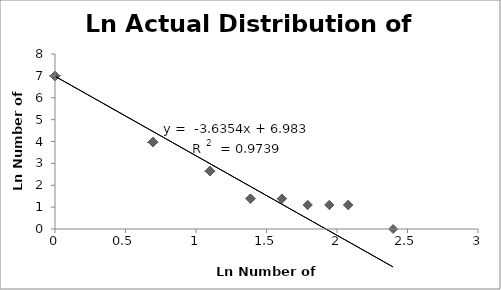
| Category | LnActual Number of Athletes |
|---|---|
| 2.3978952727983707 | 0 |
| 2.0794415416798357 | 1.099 |
| 2.0794415416798357 | 1.099 |
| 2.0794415416798357 | 1.099 |
| 1.9459101490553132 | 1.099 |
| 1.9459101490553132 | 1.099 |
| 1.9459101490553132 | 1.099 |
| 1.791759469228055 | 1.099 |
| 1.791759469228055 | 1.099 |
| 1.791759469228055 | 1.099 |
| 1.6094379124341003 | 1.386 |
| 1.6094379124341003 | 1.386 |
| 1.6094379124341003 | 1.386 |
| 1.6094379124341003 | 1.386 |
| 1.3862943611198906 | 1.386 |
| 1.3862943611198906 | 1.386 |
| 1.3862943611198906 | 1.386 |
| 1.3862943611198906 | 1.386 |
| 1.0986122886681098 | 2.639 |
| 1.0986122886681098 | 2.639 |
| 1.0986122886681098 | 2.639 |
| 1.0986122886681098 | 2.639 |
| 1.0986122886681098 | 2.639 |
| 1.0986122886681098 | 2.639 |
| 1.0986122886681098 | 2.639 |
| 1.0986122886681098 | 2.639 |
| 1.0986122886681098 | 2.639 |
| 1.0986122886681098 | 2.639 |
| 1.0986122886681098 | 2.639 |
| 1.0986122886681098 | 2.639 |
| 1.0986122886681098 | 2.639 |
| 1.0986122886681098 | 2.639 |
| 0.6931471805599453 | 3.97 |
| 0.6931471805599453 | 3.97 |
| 0.6931471805599453 | 3.97 |
| 0.6931471805599453 | 3.97 |
| 0.6931471805599453 | 3.97 |
| 0.6931471805599453 | 3.97 |
| 0.6931471805599453 | 3.97 |
| 0.6931471805599453 | 3.97 |
| 0.6931471805599453 | 3.97 |
| 0.6931471805599453 | 3.97 |
| 0.6931471805599453 | 3.97 |
| 0.6931471805599453 | 3.97 |
| 0.6931471805599453 | 3.97 |
| 0.6931471805599453 | 3.97 |
| 0.6931471805599453 | 3.97 |
| 0.6931471805599453 | 3.97 |
| 0.6931471805599453 | 3.97 |
| 0.6931471805599453 | 3.97 |
| 0.6931471805599453 | 3.97 |
| 0.6931471805599453 | 3.97 |
| 0.6931471805599453 | 3.97 |
| 0.6931471805599453 | 3.97 |
| 0.6931471805599453 | 3.97 |
| 0.6931471805599453 | 3.97 |
| 0.6931471805599453 | 3.97 |
| 0.6931471805599453 | 3.97 |
| 0.6931471805599453 | 3.97 |
| 0.6931471805599453 | 3.97 |
| 0.6931471805599453 | 3.97 |
| 0.6931471805599453 | 3.97 |
| 0.6931471805599453 | 3.97 |
| 0.6931471805599453 | 3.97 |
| 0.6931471805599453 | 3.97 |
| 0.6931471805599453 | 3.97 |
| 0.6931471805599453 | 3.97 |
| 0.6931471805599453 | 3.97 |
| 0.6931471805599453 | 3.97 |
| 0.6931471805599453 | 3.97 |
| 0.6931471805599453 | 3.97 |
| 0.6931471805599453 | 3.97 |
| 0.6931471805599453 | 3.97 |
| 0.6931471805599453 | 3.97 |
| 0.6931471805599453 | 3.97 |
| 0.6931471805599453 | 3.97 |
| 0.6931471805599453 | 3.97 |
| 0.6931471805599453 | 3.97 |
| 0.6931471805599453 | 3.97 |
| 0.6931471805599453 | 3.97 |
| 0.6931471805599453 | 3.97 |
| 0.6931471805599453 | 3.97 |
| 0.6931471805599453 | 3.97 |
| 0.6931471805599453 | 3.97 |
| 0.6931471805599453 | 3.97 |
| 0.0 | 7.001 |
| 0.0 | 7.001 |
| 0.0 | 7.001 |
| 0.0 | 7.001 |
| 0.0 | 7.001 |
| 0.0 | 7.001 |
| 0.0 | 7.001 |
| 0.0 | 7.001 |
| 0.0 | 7.001 |
| 0.0 | 7.001 |
| 0.0 | 7.001 |
| 0.0 | 7.001 |
| 0.0 | 7.001 |
| 0.0 | 7.001 |
| 0.0 | 7.001 |
| 0.0 | 7.001 |
| 0.0 | 7.001 |
| 0.0 | 7.001 |
| 0.0 | 7.001 |
| 0.0 | 7.001 |
| 0.0 | 7.001 |
| 0.0 | 7.001 |
| 0.0 | 7.001 |
| 0.0 | 7.001 |
| 0.0 | 7.001 |
| 0.0 | 7.001 |
| 0.0 | 7.001 |
| 0.0 | 7.001 |
| 0.0 | 7.001 |
| 0.0 | 7.001 |
| 0.0 | 7.001 |
| 0.0 | 7.001 |
| 0.0 | 7.001 |
| 0.0 | 7.001 |
| 0.0 | 7.001 |
| 0.0 | 7.001 |
| 0.0 | 7.001 |
| 0.0 | 7.001 |
| 0.0 | 7.001 |
| 0.0 | 7.001 |
| 0.0 | 7.001 |
| 0.0 | 7.001 |
| 0.0 | 7.001 |
| 0.0 | 7.001 |
| 0.0 | 7.001 |
| 0.0 | 7.001 |
| 0.0 | 7.001 |
| 0.0 | 7.001 |
| 0.0 | 7.001 |
| 0.0 | 7.001 |
| 0.0 | 7.001 |
| 0.0 | 7.001 |
| 0.0 | 7.001 |
| 0.0 | 7.001 |
| 0.0 | 7.001 |
| 0.0 | 7.001 |
| 0.0 | 7.001 |
| 0.0 | 7.001 |
| 0.0 | 7.001 |
| 0.0 | 7.001 |
| 0.0 | 7.001 |
| 0.0 | 7.001 |
| 0.0 | 7.001 |
| 0.0 | 7.001 |
| 0.0 | 7.001 |
| 0.0 | 7.001 |
| 0.0 | 7.001 |
| 0.0 | 7.001 |
| 0.0 | 7.001 |
| 0.0 | 7.001 |
| 0.0 | 7.001 |
| 0.0 | 7.001 |
| 0.0 | 7.001 |
| 0.0 | 7.001 |
| 0.0 | 7.001 |
| 0.0 | 7.001 |
| 0.0 | 7.001 |
| 0.0 | 7.001 |
| 0.0 | 7.001 |
| 0.0 | 7.001 |
| 0.0 | 7.001 |
| 0.0 | 7.001 |
| 0.0 | 7.001 |
| 0.0 | 7.001 |
| 0.0 | 7.001 |
| 0.0 | 7.001 |
| 0.0 | 7.001 |
| 0.0 | 7.001 |
| 0.0 | 7.001 |
| 0.0 | 7.001 |
| 0.0 | 7.001 |
| 0.0 | 7.001 |
| 0.0 | 7.001 |
| 0.0 | 7.001 |
| 0.0 | 7.001 |
| 0.0 | 7.001 |
| 0.0 | 7.001 |
| 0.0 | 7.001 |
| 0.0 | 7.001 |
| 0.0 | 7.001 |
| 0.0 | 7.001 |
| 0.0 | 7.001 |
| 0.0 | 7.001 |
| 0.0 | 7.001 |
| 0.0 | 7.001 |
| 0.0 | 7.001 |
| 0.0 | 7.001 |
| 0.0 | 7.001 |
| 0.0 | 7.001 |
| 0.0 | 7.001 |
| 0.0 | 7.001 |
| 0.0 | 7.001 |
| 0.0 | 7.001 |
| 0.0 | 7.001 |
| 0.0 | 7.001 |
| 0.0 | 7.001 |
| 0.0 | 7.001 |
| 0.0 | 7.001 |
| 0.0 | 7.001 |
| 0.0 | 7.001 |
| 0.0 | 7.001 |
| 0.0 | 7.001 |
| 0.0 | 7.001 |
| 0.0 | 7.001 |
| 0.0 | 7.001 |
| 0.0 | 7.001 |
| 0.0 | 7.001 |
| 0.0 | 7.001 |
| 0.0 | 7.001 |
| 0.0 | 7.001 |
| 0.0 | 7.001 |
| 0.0 | 7.001 |
| 0.0 | 7.001 |
| 0.0 | 7.001 |
| 0.0 | 7.001 |
| 0.0 | 7.001 |
| 0.0 | 7.001 |
| 0.0 | 7.001 |
| 0.0 | 7.001 |
| 0.0 | 7.001 |
| 0.0 | 7.001 |
| 0.0 | 7.001 |
| 0.0 | 7.001 |
| 0.0 | 7.001 |
| 0.0 | 7.001 |
| 0.0 | 7.001 |
| 0.0 | 7.001 |
| 0.0 | 7.001 |
| 0.0 | 7.001 |
| 0.0 | 7.001 |
| 0.0 | 7.001 |
| 0.0 | 7.001 |
| 0.0 | 7.001 |
| 0.0 | 7.001 |
| 0.0 | 7.001 |
| 0.0 | 7.001 |
| 0.0 | 7.001 |
| 0.0 | 7.001 |
| 0.0 | 7.001 |
| 0.0 | 7.001 |
| 0.0 | 7.001 |
| 0.0 | 7.001 |
| 0.0 | 7.001 |
| 0.0 | 7.001 |
| 0.0 | 7.001 |
| 0.0 | 7.001 |
| 0.0 | 7.001 |
| 0.0 | 7.001 |
| 0.0 | 7.001 |
| 0.0 | 7.001 |
| 0.0 | 7.001 |
| 0.0 | 7.001 |
| 0.0 | 7.001 |
| 0.0 | 7.001 |
| 0.0 | 7.001 |
| 0.0 | 7.001 |
| 0.0 | 7.001 |
| 0.0 | 7.001 |
| 0.0 | 7.001 |
| 0.0 | 7.001 |
| 0.0 | 7.001 |
| 0.0 | 7.001 |
| 0.0 | 7.001 |
| 0.0 | 7.001 |
| 0.0 | 7.001 |
| 0.0 | 7.001 |
| 0.0 | 7.001 |
| 0.0 | 7.001 |
| 0.0 | 7.001 |
| 0.0 | 7.001 |
| 0.0 | 7.001 |
| 0.0 | 7.001 |
| 0.0 | 7.001 |
| 0.0 | 7.001 |
| 0.0 | 7.001 |
| 0.0 | 7.001 |
| 0.0 | 7.001 |
| 0.0 | 7.001 |
| 0.0 | 7.001 |
| 0.0 | 7.001 |
| 0.0 | 7.001 |
| 0.0 | 7.001 |
| 0.0 | 7.001 |
| 0.0 | 7.001 |
| 0.0 | 7.001 |
| 0.0 | 7.001 |
| 0.0 | 7.001 |
| 0.0 | 7.001 |
| 0.0 | 7.001 |
| 0.0 | 7.001 |
| 0.0 | 7.001 |
| 0.0 | 7.001 |
| 0.0 | 7.001 |
| 0.0 | 7.001 |
| 0.0 | 7.001 |
| 0.0 | 7.001 |
| 0.0 | 7.001 |
| 0.0 | 7.001 |
| 0.0 | 7.001 |
| 0.0 | 7.001 |
| 0.0 | 7.001 |
| 0.0 | 7.001 |
| 0.0 | 7.001 |
| 0.0 | 7.001 |
| 0.0 | 7.001 |
| 0.0 | 7.001 |
| 0.0 | 7.001 |
| 0.0 | 7.001 |
| 0.0 | 7.001 |
| 0.0 | 7.001 |
| 0.0 | 7.001 |
| 0.0 | 7.001 |
| 0.0 | 7.001 |
| 0.0 | 7.001 |
| 0.0 | 7.001 |
| 0.0 | 7.001 |
| 0.0 | 7.001 |
| 0.0 | 7.001 |
| 0.0 | 7.001 |
| 0.0 | 7.001 |
| 0.0 | 7.001 |
| 0.0 | 7.001 |
| 0.0 | 7.001 |
| 0.0 | 7.001 |
| 0.0 | 7.001 |
| 0.0 | 7.001 |
| 0.0 | 7.001 |
| 0.0 | 7.001 |
| 0.0 | 7.001 |
| 0.0 | 7.001 |
| 0.0 | 7.001 |
| 0.0 | 7.001 |
| 0.0 | 7.001 |
| 0.0 | 7.001 |
| 0.0 | 7.001 |
| 0.0 | 7.001 |
| 0.0 | 7.001 |
| 0.0 | 7.001 |
| 0.0 | 7.001 |
| 0.0 | 7.001 |
| 0.0 | 7.001 |
| 0.0 | 7.001 |
| 0.0 | 7.001 |
| 0.0 | 7.001 |
| 0.0 | 7.001 |
| 0.0 | 7.001 |
| 0.0 | 7.001 |
| 0.0 | 7.001 |
| 0.0 | 7.001 |
| 0.0 | 7.001 |
| 0.0 | 7.001 |
| 0.0 | 7.001 |
| 0.0 | 7.001 |
| 0.0 | 7.001 |
| 0.0 | 7.001 |
| 0.0 | 7.001 |
| 0.0 | 7.001 |
| 0.0 | 7.001 |
| 0.0 | 7.001 |
| 0.0 | 7.001 |
| 0.0 | 7.001 |
| 0.0 | 7.001 |
| 0.0 | 7.001 |
| 0.0 | 7.001 |
| 0.0 | 7.001 |
| 0.0 | 7.001 |
| 0.0 | 7.001 |
| 0.0 | 7.001 |
| 0.0 | 7.001 |
| 0.0 | 7.001 |
| 0.0 | 7.001 |
| 0.0 | 7.001 |
| 0.0 | 7.001 |
| 0.0 | 7.001 |
| 0.0 | 7.001 |
| 0.0 | 7.001 |
| 0.0 | 7.001 |
| 0.0 | 7.001 |
| 0.0 | 7.001 |
| 0.0 | 7.001 |
| 0.0 | 7.001 |
| 0.0 | 7.001 |
| 0.0 | 7.001 |
| 0.0 | 7.001 |
| 0.0 | 7.001 |
| 0.0 | 7.001 |
| 0.0 | 7.001 |
| 0.0 | 7.001 |
| 0.0 | 7.001 |
| 0.0 | 7.001 |
| 0.0 | 7.001 |
| 0.0 | 7.001 |
| 0.0 | 7.001 |
| 0.0 | 7.001 |
| 0.0 | 7.001 |
| 0.0 | 7.001 |
| 0.0 | 7.001 |
| 0.0 | 7.001 |
| 0.0 | 7.001 |
| 0.0 | 7.001 |
| 0.0 | 7.001 |
| 0.0 | 7.001 |
| 0.0 | 7.001 |
| 0.0 | 7.001 |
| 0.0 | 7.001 |
| 0.0 | 7.001 |
| 0.0 | 7.001 |
| 0.0 | 7.001 |
| 0.0 | 7.001 |
| 0.0 | 7.001 |
| 0.0 | 7.001 |
| 0.0 | 7.001 |
| 0.0 | 7.001 |
| 0.0 | 7.001 |
| 0.0 | 7.001 |
| 0.0 | 7.001 |
| 0.0 | 7.001 |
| 0.0 | 7.001 |
| 0.0 | 7.001 |
| 0.0 | 7.001 |
| 0.0 | 7.001 |
| 0.0 | 7.001 |
| 0.0 | 7.001 |
| 0.0 | 7.001 |
| 0.0 | 7.001 |
| 0.0 | 7.001 |
| 0.0 | 7.001 |
| 0.0 | 7.001 |
| 0.0 | 7.001 |
| 0.0 | 7.001 |
| 0.0 | 7.001 |
| 0.0 | 7.001 |
| 0.0 | 7.001 |
| 0.0 | 7.001 |
| 0.0 | 7.001 |
| 0.0 | 7.001 |
| 0.0 | 7.001 |
| 0.0 | 7.001 |
| 0.0 | 7.001 |
| 0.0 | 7.001 |
| 0.0 | 7.001 |
| 0.0 | 7.001 |
| 0.0 | 7.001 |
| 0.0 | 7.001 |
| 0.0 | 7.001 |
| 0.0 | 7.001 |
| 0.0 | 7.001 |
| 0.0 | 7.001 |
| 0.0 | 7.001 |
| 0.0 | 7.001 |
| 0.0 | 7.001 |
| 0.0 | 7.001 |
| 0.0 | 7.001 |
| 0.0 | 7.001 |
| 0.0 | 7.001 |
| 0.0 | 7.001 |
| 0.0 | 7.001 |
| 0.0 | 7.001 |
| 0.0 | 7.001 |
| 0.0 | 7.001 |
| 0.0 | 7.001 |
| 0.0 | 7.001 |
| 0.0 | 7.001 |
| 0.0 | 7.001 |
| 0.0 | 7.001 |
| 0.0 | 7.001 |
| 0.0 | 7.001 |
| 0.0 | 7.001 |
| 0.0 | 7.001 |
| 0.0 | 7.001 |
| 0.0 | 7.001 |
| 0.0 | 7.001 |
| 0.0 | 7.001 |
| 0.0 | 7.001 |
| 0.0 | 7.001 |
| 0.0 | 7.001 |
| 0.0 | 7.001 |
| 0.0 | 7.001 |
| 0.0 | 7.001 |
| 0.0 | 7.001 |
| 0.0 | 7.001 |
| 0.0 | 7.001 |
| 0.0 | 7.001 |
| 0.0 | 7.001 |
| 0.0 | 7.001 |
| 0.0 | 7.001 |
| 0.0 | 7.001 |
| 0.0 | 7.001 |
| 0.0 | 7.001 |
| 0.0 | 7.001 |
| 0.0 | 7.001 |
| 0.0 | 7.001 |
| 0.0 | 7.001 |
| 0.0 | 7.001 |
| 0.0 | 7.001 |
| 0.0 | 7.001 |
| 0.0 | 7.001 |
| 0.0 | 7.001 |
| 0.0 | 7.001 |
| 0.0 | 7.001 |
| 0.0 | 7.001 |
| 0.0 | 7.001 |
| 0.0 | 7.001 |
| 0.0 | 7.001 |
| 0.0 | 7.001 |
| 0.0 | 7.001 |
| 0.0 | 7.001 |
| 0.0 | 7.001 |
| 0.0 | 7.001 |
| 0.0 | 7.001 |
| 0.0 | 7.001 |
| 0.0 | 7.001 |
| 0.0 | 7.001 |
| 0.0 | 7.001 |
| 0.0 | 7.001 |
| 0.0 | 7.001 |
| 0.0 | 7.001 |
| 0.0 | 7.001 |
| 0.0 | 7.001 |
| 0.0 | 7.001 |
| 0.0 | 7.001 |
| 0.0 | 7.001 |
| 0.0 | 7.001 |
| 0.0 | 7.001 |
| 0.0 | 7.001 |
| 0.0 | 7.001 |
| 0.0 | 7.001 |
| 0.0 | 7.001 |
| 0.0 | 7.001 |
| 0.0 | 7.001 |
| 0.0 | 7.001 |
| 0.0 | 7.001 |
| 0.0 | 7.001 |
| 0.0 | 7.001 |
| 0.0 | 7.001 |
| 0.0 | 7.001 |
| 0.0 | 7.001 |
| 0.0 | 7.001 |
| 0.0 | 7.001 |
| 0.0 | 7.001 |
| 0.0 | 7.001 |
| 0.0 | 7.001 |
| 0.0 | 7.001 |
| 0.0 | 7.001 |
| 0.0 | 7.001 |
| 0.0 | 7.001 |
| 0.0 | 7.001 |
| 0.0 | 7.001 |
| 0.0 | 7.001 |
| 0.0 | 7.001 |
| 0.0 | 7.001 |
| 0.0 | 7.001 |
| 0.0 | 7.001 |
| 0.0 | 7.001 |
| 0.0 | 7.001 |
| 0.0 | 7.001 |
| 0.0 | 7.001 |
| 0.0 | 7.001 |
| 0.0 | 7.001 |
| 0.0 | 7.001 |
| 0.0 | 7.001 |
| 0.0 | 7.001 |
| 0.0 | 7.001 |
| 0.0 | 7.001 |
| 0.0 | 7.001 |
| 0.0 | 7.001 |
| 0.0 | 7.001 |
| 0.0 | 7.001 |
| 0.0 | 7.001 |
| 0.0 | 7.001 |
| 0.0 | 7.001 |
| 0.0 | 7.001 |
| 0.0 | 7.001 |
| 0.0 | 7.001 |
| 0.0 | 7.001 |
| 0.0 | 7.001 |
| 0.0 | 7.001 |
| 0.0 | 7.001 |
| 0.0 | 7.001 |
| 0.0 | 7.001 |
| 0.0 | 7.001 |
| 0.0 | 7.001 |
| 0.0 | 7.001 |
| 0.0 | 7.001 |
| 0.0 | 7.001 |
| 0.0 | 7.001 |
| 0.0 | 7.001 |
| 0.0 | 7.001 |
| 0.0 | 7.001 |
| 0.0 | 7.001 |
| 0.0 | 7.001 |
| 0.0 | 7.001 |
| 0.0 | 7.001 |
| 0.0 | 7.001 |
| 0.0 | 7.001 |
| 0.0 | 7.001 |
| 0.0 | 7.001 |
| 0.0 | 7.001 |
| 0.0 | 7.001 |
| 0.0 | 7.001 |
| 0.0 | 7.001 |
| 0.0 | 7.001 |
| 0.0 | 7.001 |
| 0.0 | 7.001 |
| 0.0 | 7.001 |
| 0.0 | 7.001 |
| 0.0 | 7.001 |
| 0.0 | 7.001 |
| 0.0 | 7.001 |
| 0.0 | 7.001 |
| 0.0 | 7.001 |
| 0.0 | 7.001 |
| 0.0 | 7.001 |
| 0.0 | 7.001 |
| 0.0 | 7.001 |
| 0.0 | 7.001 |
| 0.0 | 7.001 |
| 0.0 | 7.001 |
| 0.0 | 7.001 |
| 0.0 | 7.001 |
| 0.0 | 7.001 |
| 0.0 | 7.001 |
| 0.0 | 7.001 |
| 0.0 | 7.001 |
| 0.0 | 7.001 |
| 0.0 | 7.001 |
| 0.0 | 7.001 |
| 0.0 | 7.001 |
| 0.0 | 7.001 |
| 0.0 | 7.001 |
| 0.0 | 7.001 |
| 0.0 | 7.001 |
| 0.0 | 7.001 |
| 0.0 | 7.001 |
| 0.0 | 7.001 |
| 0.0 | 7.001 |
| 0.0 | 7.001 |
| 0.0 | 7.001 |
| 0.0 | 7.001 |
| 0.0 | 7.001 |
| 0.0 | 7.001 |
| 0.0 | 7.001 |
| 0.0 | 7.001 |
| 0.0 | 7.001 |
| 0.0 | 7.001 |
| 0.0 | 7.001 |
| 0.0 | 7.001 |
| 0.0 | 7.001 |
| 0.0 | 7.001 |
| 0.0 | 7.001 |
| 0.0 | 7.001 |
| 0.0 | 7.001 |
| 0.0 | 7.001 |
| 0.0 | 7.001 |
| 0.0 | 7.001 |
| 0.0 | 7.001 |
| 0.0 | 7.001 |
| 0.0 | 7.001 |
| 0.0 | 7.001 |
| 0.0 | 7.001 |
| 0.0 | 7.001 |
| 0.0 | 7.001 |
| 0.0 | 7.001 |
| 0.0 | 7.001 |
| 0.0 | 7.001 |
| 0.0 | 7.001 |
| 0.0 | 7.001 |
| 0.0 | 7.001 |
| 0.0 | 7.001 |
| 0.0 | 7.001 |
| 0.0 | 7.001 |
| 0.0 | 7.001 |
| 0.0 | 7.001 |
| 0.0 | 7.001 |
| 0.0 | 7.001 |
| 0.0 | 7.001 |
| 0.0 | 7.001 |
| 0.0 | 7.001 |
| 0.0 | 7.001 |
| 0.0 | 7.001 |
| 0.0 | 7.001 |
| 0.0 | 7.001 |
| 0.0 | 7.001 |
| 0.0 | 7.001 |
| 0.0 | 7.001 |
| 0.0 | 7.001 |
| 0.0 | 7.001 |
| 0.0 | 7.001 |
| 0.0 | 7.001 |
| 0.0 | 7.001 |
| 0.0 | 7.001 |
| 0.0 | 7.001 |
| 0.0 | 7.001 |
| 0.0 | 7.001 |
| 0.0 | 7.001 |
| 0.0 | 7.001 |
| 0.0 | 7.001 |
| 0.0 | 7.001 |
| 0.0 | 7.001 |
| 0.0 | 7.001 |
| 0.0 | 7.001 |
| 0.0 | 7.001 |
| 0.0 | 7.001 |
| 0.0 | 7.001 |
| 0.0 | 7.001 |
| 0.0 | 7.001 |
| 0.0 | 7.001 |
| 0.0 | 7.001 |
| 0.0 | 7.001 |
| 0.0 | 7.001 |
| 0.0 | 7.001 |
| 0.0 | 7.001 |
| 0.0 | 7.001 |
| 0.0 | 7.001 |
| 0.0 | 7.001 |
| 0.0 | 7.001 |
| 0.0 | 7.001 |
| 0.0 | 7.001 |
| 0.0 | 7.001 |
| 0.0 | 7.001 |
| 0.0 | 7.001 |
| 0.0 | 7.001 |
| 0.0 | 7.001 |
| 0.0 | 7.001 |
| 0.0 | 7.001 |
| 0.0 | 7.001 |
| 0.0 | 7.001 |
| 0.0 | 7.001 |
| 0.0 | 7.001 |
| 0.0 | 7.001 |
| 0.0 | 7.001 |
| 0.0 | 7.001 |
| 0.0 | 7.001 |
| 0.0 | 7.001 |
| 0.0 | 7.001 |
| 0.0 | 7.001 |
| 0.0 | 7.001 |
| 0.0 | 7.001 |
| 0.0 | 7.001 |
| 0.0 | 7.001 |
| 0.0 | 7.001 |
| 0.0 | 7.001 |
| 0.0 | 7.001 |
| 0.0 | 7.001 |
| 0.0 | 7.001 |
| 0.0 | 7.001 |
| 0.0 | 7.001 |
| 0.0 | 7.001 |
| 0.0 | 7.001 |
| 0.0 | 7.001 |
| 0.0 | 7.001 |
| 0.0 | 7.001 |
| 0.0 | 7.001 |
| 0.0 | 7.001 |
| 0.0 | 7.001 |
| 0.0 | 7.001 |
| 0.0 | 7.001 |
| 0.0 | 7.001 |
| 0.0 | 7.001 |
| 0.0 | 7.001 |
| 0.0 | 7.001 |
| 0.0 | 7.001 |
| 0.0 | 7.001 |
| 0.0 | 7.001 |
| 0.0 | 7.001 |
| 0.0 | 7.001 |
| 0.0 | 7.001 |
| 0.0 | 7.001 |
| 0.0 | 7.001 |
| 0.0 | 7.001 |
| 0.0 | 7.001 |
| 0.0 | 7.001 |
| 0.0 | 7.001 |
| 0.0 | 7.001 |
| 0.0 | 7.001 |
| 0.0 | 7.001 |
| 0.0 | 7.001 |
| 0.0 | 7.001 |
| 0.0 | 7.001 |
| 0.0 | 7.001 |
| 0.0 | 7.001 |
| 0.0 | 7.001 |
| 0.0 | 7.001 |
| 0.0 | 7.001 |
| 0.0 | 7.001 |
| 0.0 | 7.001 |
| 0.0 | 7.001 |
| 0.0 | 7.001 |
| 0.0 | 7.001 |
| 0.0 | 7.001 |
| 0.0 | 7.001 |
| 0.0 | 7.001 |
| 0.0 | 7.001 |
| 0.0 | 7.001 |
| 0.0 | 7.001 |
| 0.0 | 7.001 |
| 0.0 | 7.001 |
| 0.0 | 7.001 |
| 0.0 | 7.001 |
| 0.0 | 7.001 |
| 0.0 | 7.001 |
| 0.0 | 7.001 |
| 0.0 | 7.001 |
| 0.0 | 7.001 |
| 0.0 | 7.001 |
| 0.0 | 7.001 |
| 0.0 | 7.001 |
| 0.0 | 7.001 |
| 0.0 | 7.001 |
| 0.0 | 7.001 |
| 0.0 | 7.001 |
| 0.0 | 7.001 |
| 0.0 | 7.001 |
| 0.0 | 7.001 |
| 0.0 | 7.001 |
| 0.0 | 7.001 |
| 0.0 | 7.001 |
| 0.0 | 7.001 |
| 0.0 | 7.001 |
| 0.0 | 7.001 |
| 0.0 | 7.001 |
| 0.0 | 7.001 |
| 0.0 | 7.001 |
| 0.0 | 7.001 |
| 0.0 | 7.001 |
| 0.0 | 7.001 |
| 0.0 | 7.001 |
| 0.0 | 7.001 |
| 0.0 | 7.001 |
| 0.0 | 7.001 |
| 0.0 | 7.001 |
| 0.0 | 7.001 |
| 0.0 | 7.001 |
| 0.0 | 7.001 |
| 0.0 | 7.001 |
| 0.0 | 7.001 |
| 0.0 | 7.001 |
| 0.0 | 7.001 |
| 0.0 | 7.001 |
| 0.0 | 7.001 |
| 0.0 | 7.001 |
| 0.0 | 7.001 |
| 0.0 | 7.001 |
| 0.0 | 7.001 |
| 0.0 | 7.001 |
| 0.0 | 7.001 |
| 0.0 | 7.001 |
| 0.0 | 7.001 |
| 0.0 | 7.001 |
| 0.0 | 7.001 |
| 0.0 | 7.001 |
| 0.0 | 7.001 |
| 0.0 | 7.001 |
| 0.0 | 7.001 |
| 0.0 | 7.001 |
| 0.0 | 7.001 |
| 0.0 | 7.001 |
| 0.0 | 7.001 |
| 0.0 | 7.001 |
| 0.0 | 7.001 |
| 0.0 | 7.001 |
| 0.0 | 7.001 |
| 0.0 | 7.001 |
| 0.0 | 7.001 |
| 0.0 | 7.001 |
| 0.0 | 7.001 |
| 0.0 | 7.001 |
| 0.0 | 7.001 |
| 0.0 | 7.001 |
| 0.0 | 7.001 |
| 0.0 | 7.001 |
| 0.0 | 7.001 |
| 0.0 | 7.001 |
| 0.0 | 7.001 |
| 0.0 | 7.001 |
| 0.0 | 7.001 |
| 0.0 | 7.001 |
| 0.0 | 7.001 |
| 0.0 | 7.001 |
| 0.0 | 7.001 |
| 0.0 | 7.001 |
| 0.0 | 7.001 |
| 0.0 | 7.001 |
| 0.0 | 7.001 |
| 0.0 | 7.001 |
| 0.0 | 7.001 |
| 0.0 | 7.001 |
| 0.0 | 7.001 |
| 0.0 | 7.001 |
| 0.0 | 7.001 |
| 0.0 | 7.001 |
| 0.0 | 7.001 |
| 0.0 | 7.001 |
| 0.0 | 7.001 |
| 0.0 | 7.001 |
| 0.0 | 7.001 |
| 0.0 | 7.001 |
| 0.0 | 7.001 |
| 0.0 | 7.001 |
| 0.0 | 7.001 |
| 0.0 | 7.001 |
| 0.0 | 7.001 |
| 0.0 | 7.001 |
| 0.0 | 7.001 |
| 0.0 | 7.001 |
| 0.0 | 7.001 |
| 0.0 | 7.001 |
| 0.0 | 7.001 |
| 0.0 | 7.001 |
| 0.0 | 7.001 |
| 0.0 | 7.001 |
| 0.0 | 7.001 |
| 0.0 | 7.001 |
| 0.0 | 7.001 |
| 0.0 | 7.001 |
| 0.0 | 7.001 |
| 0.0 | 7.001 |
| 0.0 | 7.001 |
| 0.0 | 7.001 |
| 0.0 | 7.001 |
| 0.0 | 7.001 |
| 0.0 | 7.001 |
| 0.0 | 7.001 |
| 0.0 | 7.001 |
| 0.0 | 7.001 |
| 0.0 | 7.001 |
| 0.0 | 7.001 |
| 0.0 | 7.001 |
| 0.0 | 7.001 |
| 0.0 | 7.001 |
| 0.0 | 7.001 |
| 0.0 | 7.001 |
| 0.0 | 7.001 |
| 0.0 | 7.001 |
| 0.0 | 7.001 |
| 0.0 | 7.001 |
| 0.0 | 7.001 |
| 0.0 | 7.001 |
| 0.0 | 7.001 |
| 0.0 | 7.001 |
| 0.0 | 7.001 |
| 0.0 | 7.001 |
| 0.0 | 7.001 |
| 0.0 | 7.001 |
| 0.0 | 7.001 |
| 0.0 | 7.001 |
| 0.0 | 7.001 |
| 0.0 | 7.001 |
| 0.0 | 7.001 |
| 0.0 | 7.001 |
| 0.0 | 7.001 |
| 0.0 | 7.001 |
| 0.0 | 7.001 |
| 0.0 | 7.001 |
| 0.0 | 7.001 |
| 0.0 | 7.001 |
| 0.0 | 7.001 |
| 0.0 | 7.001 |
| 0.0 | 7.001 |
| 0.0 | 7.001 |
| 0.0 | 7.001 |
| 0.0 | 7.001 |
| 0.0 | 7.001 |
| 0.0 | 7.001 |
| 0.0 | 7.001 |
| 0.0 | 7.001 |
| 0.0 | 7.001 |
| 0.0 | 7.001 |
| 0.0 | 7.001 |
| 0.0 | 7.001 |
| 0.0 | 7.001 |
| 0.0 | 7.001 |
| 0.0 | 7.001 |
| 0.0 | 7.001 |
| 0.0 | 7.001 |
| 0.0 | 7.001 |
| 0.0 | 7.001 |
| 0.0 | 7.001 |
| 0.0 | 7.001 |
| 0.0 | 7.001 |
| 0.0 | 7.001 |
| 0.0 | 7.001 |
| 0.0 | 7.001 |
| 0.0 | 7.001 |
| 0.0 | 7.001 |
| 0.0 | 7.001 |
| 0.0 | 7.001 |
| 0.0 | 7.001 |
| 0.0 | 7.001 |
| 0.0 | 7.001 |
| 0.0 | 7.001 |
| 0.0 | 7.001 |
| 0.0 | 7.001 |
| 0.0 | 7.001 |
| 0.0 | 7.001 |
| 0.0 | 7.001 |
| 0.0 | 7.001 |
| 0.0 | 7.001 |
| 0.0 | 7.001 |
| 0.0 | 7.001 |
| 0.0 | 7.001 |
| 0.0 | 7.001 |
| 0.0 | 7.001 |
| 0.0 | 7.001 |
| 0.0 | 7.001 |
| 0.0 | 7.001 |
| 0.0 | 7.001 |
| 0.0 | 7.001 |
| 0.0 | 7.001 |
| 0.0 | 7.001 |
| 0.0 | 7.001 |
| 0.0 | 7.001 |
| 0.0 | 7.001 |
| 0.0 | 7.001 |
| 0.0 | 7.001 |
| 0.0 | 7.001 |
| 0.0 | 7.001 |
| 0.0 | 7.001 |
| 0.0 | 7.001 |
| 0.0 | 7.001 |
| 0.0 | 7.001 |
| 0.0 | 7.001 |
| 0.0 | 7.001 |
| 0.0 | 7.001 |
| 0.0 | 7.001 |
| 0.0 | 7.001 |
| 0.0 | 7.001 |
| 0.0 | 7.001 |
| 0.0 | 7.001 |
| 0.0 | 7.001 |
| 0.0 | 7.001 |
| 0.0 | 7.001 |
| 0.0 | 7.001 |
| 0.0 | 7.001 |
| 0.0 | 7.001 |
| 0.0 | 7.001 |
| 0.0 | 7.001 |
| 0.0 | 7.001 |
| 0.0 | 7.001 |
| 0.0 | 7.001 |
| 0.0 | 7.001 |
| 0.0 | 7.001 |
| 0.0 | 7.001 |
| 0.0 | 7.001 |
| 0.0 | 7.001 |
| 0.0 | 7.001 |
| 0.0 | 7.001 |
| 0.0 | 7.001 |
| 0.0 | 7.001 |
| 0.0 | 7.001 |
| 0.0 | 7.001 |
| 0.0 | 7.001 |
| 0.0 | 7.001 |
| 0.0 | 7.001 |
| 0.0 | 7.001 |
| 0.0 | 7.001 |
| 0.0 | 7.001 |
| 0.0 | 7.001 |
| 0.0 | 7.001 |
| 0.0 | 7.001 |
| 0.0 | 7.001 |
| 0.0 | 7.001 |
| 0.0 | 7.001 |
| 0.0 | 7.001 |
| 0.0 | 7.001 |
| 0.0 | 7.001 |
| 0.0 | 7.001 |
| 0.0 | 7.001 |
| 0.0 | 7.001 |
| 0.0 | 7.001 |
| 0.0 | 7.001 |
| 0.0 | 7.001 |
| 0.0 | 7.001 |
| 0.0 | 7.001 |
| 0.0 | 7.001 |
| 0.0 | 7.001 |
| 0.0 | 7.001 |
| 0.0 | 7.001 |
| 0.0 | 7.001 |
| 0.0 | 7.001 |
| 0.0 | 7.001 |
| 0.0 | 7.001 |
| 0.0 | 7.001 |
| 0.0 | 7.001 |
| 0.0 | 7.001 |
| 0.0 | 7.001 |
| 0.0 | 7.001 |
| 0.0 | 7.001 |
| 0.0 | 7.001 |
| 0.0 | 7.001 |
| 0.0 | 7.001 |
| 0.0 | 7.001 |
| 0.0 | 7.001 |
| 0.0 | 7.001 |
| 0.0 | 7.001 |
| 0.0 | 7.001 |
| 0.0 | 7.001 |
| 0.0 | 7.001 |
| 0.0 | 7.001 |
| 0.0 | 7.001 |
| 0.0 | 7.001 |
| 0.0 | 7.001 |
| 0.0 | 7.001 |
| 0.0 | 7.001 |
| 0.0 | 7.001 |
| 0.0 | 7.001 |
| 0.0 | 7.001 |
| 0.0 | 7.001 |
| 0.0 | 7.001 |
| 0.0 | 7.001 |
| 0.0 | 7.001 |
| 0.0 | 7.001 |
| 0.0 | 7.001 |
| 0.0 | 7.001 |
| 0.0 | 7.001 |
| 0.0 | 7.001 |
| 0.0 | 7.001 |
| 0.0 | 7.001 |
| 0.0 | 7.001 |
| 0.0 | 7.001 |
| 0.0 | 7.001 |
| 0.0 | 7.001 |
| 0.0 | 7.001 |
| 0.0 | 7.001 |
| 0.0 | 7.001 |
| 0.0 | 7.001 |
| 0.0 | 7.001 |
| 0.0 | 7.001 |
| 0.0 | 7.001 |
| 0.0 | 7.001 |
| 0.0 | 7.001 |
| 0.0 | 7.001 |
| 0.0 | 7.001 |
| 0.0 | 7.001 |
| 0.0 | 7.001 |
| 0.0 | 7.001 |
| 0.0 | 7.001 |
| 0.0 | 7.001 |
| 0.0 | 7.001 |
| 0.0 | 7.001 |
| 0.0 | 7.001 |
| 0.0 | 7.001 |
| 0.0 | 7.001 |
| 0.0 | 7.001 |
| 0.0 | 7.001 |
| 0.0 | 7.001 |
| 0.0 | 7.001 |
| 0.0 | 7.001 |
| 0.0 | 7.001 |
| 0.0 | 7.001 |
| 0.0 | 7.001 |
| 0.0 | 7.001 |
| 0.0 | 7.001 |
| 0.0 | 7.001 |
| 0.0 | 7.001 |
| 0.0 | 7.001 |
| 0.0 | 7.001 |
| 0.0 | 7.001 |
| 0.0 | 7.001 |
| 0.0 | 7.001 |
| 0.0 | 7.001 |
| 0.0 | 7.001 |
| 0.0 | 7.001 |
| 0.0 | 7.001 |
| 0.0 | 7.001 |
| 0.0 | 7.001 |
| 0.0 | 7.001 |
| 0.0 | 7.001 |
| 0.0 | 7.001 |
| 0.0 | 7.001 |
| 0.0 | 7.001 |
| 0.0 | 7.001 |
| 0.0 | 7.001 |
| 0.0 | 7.001 |
| 0.0 | 7.001 |
| 0.0 | 7.001 |
| 0.0 | 7.001 |
| 0.0 | 7.001 |